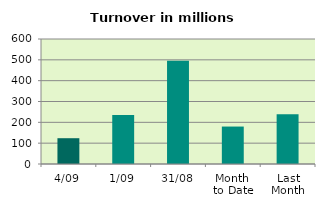
| Category | Series 0 |
|---|---|
| 4/09 | 123.791 |
| 1/09 | 235.708 |
| 31/08 | 495.506 |
| Month 
to Date | 179.75 |
| Last
Month | 239.159 |